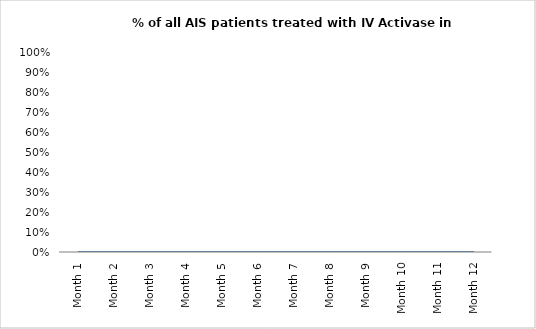
| Category | % of all AIS patients treated with IV Activase in ≤45 min |
|---|---|
| Month 1 | 0 |
| Month 2 | 0 |
| Month 3 | 0 |
| Month 4 | 0 |
| Month 5 | 0 |
| Month 6 | 0 |
| Month 7 | 0 |
| Month 8 | 0 |
| Month 9 | 0 |
| Month 10 | 0 |
| Month 11 | 0 |
| Month 12 | 0 |